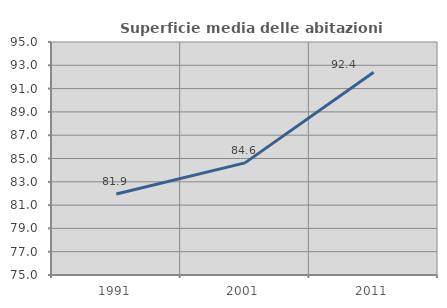
| Category | Superficie media delle abitazioni occupate |
|---|---|
| 1991.0 | 81.948 |
| 2001.0 | 84.623 |
| 2011.0 | 92.404 |